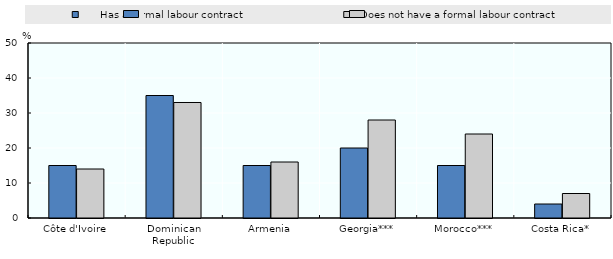
| Category |       Has a formal labour contract |   Does not have a formal labour contract |
|---|---|---|
| Côte d'Ivoire | 15 | 14 |
| Dominican Republic | 35 | 33 |
| Armenia | 15 | 16 |
| Georgia*** | 20 | 28 |
| Morocco*** | 15 | 24 |
| Costa Rica* | 4 | 7 |